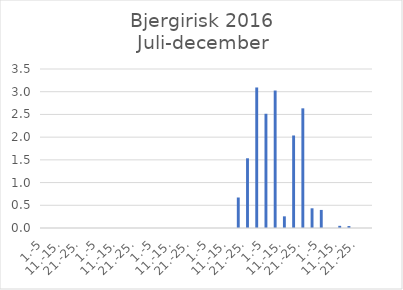
| Category | Series 0 |
|---|---|
| 1.-5 | 0 |
| 6.-10. | 0 |
| 11.-15. | 0 |
| 16.-20. | 0 |
| 21.-25. | 0 |
| 26.-31. | 0 |
| 1.-5 | 0 |
| 6.-10. | 0 |
| 11.-15. | 0 |
| 16.-20. | 0 |
| 21.-25. | 0 |
| 26.-31. | 0 |
| 1.-5 | 0 |
| 6.-10. | 0 |
| 11.-15. | 0 |
| 16.-20. | 0 |
| 21.-25. | 0 |
| 26.-30. | 0 |
| 1.-5 | 0 |
| 6.-10. | 0 |
| 11.-15. | 0 |
| 16.-20. | 0.671 |
| 21.-25. | 1.535 |
| 26.-31. | 3.093 |
| 1.-5 | 2.514 |
| 6.-10. | 3.026 |
| 11.-15. | 0.257 |
| 16.-20. | 2.037 |
| 21.-25. | 2.634 |
| 26.-30. | 0.434 |
| 1.-5 | 0.398 |
| 6.-10. | 0 |
| 11.-15. | 0.048 |
| 16.-20. | 0.043 |
| 21.-25. | 0 |
| 26.-31. | 0 |